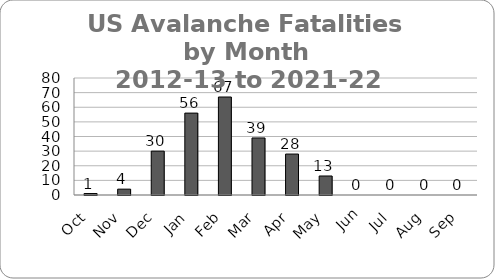
| Category | 2002-03 to 2021-22 |
|---|---|
| Oct | 1 |
| Nov | 4 |
| Dec | 30 |
| Jan | 56 |
| Feb | 67 |
| Mar | 39 |
| Apr | 28 |
| May | 13 |
| Jun | 0 |
| Jul | 0 |
| Aug | 0 |
| Sep | 0 |